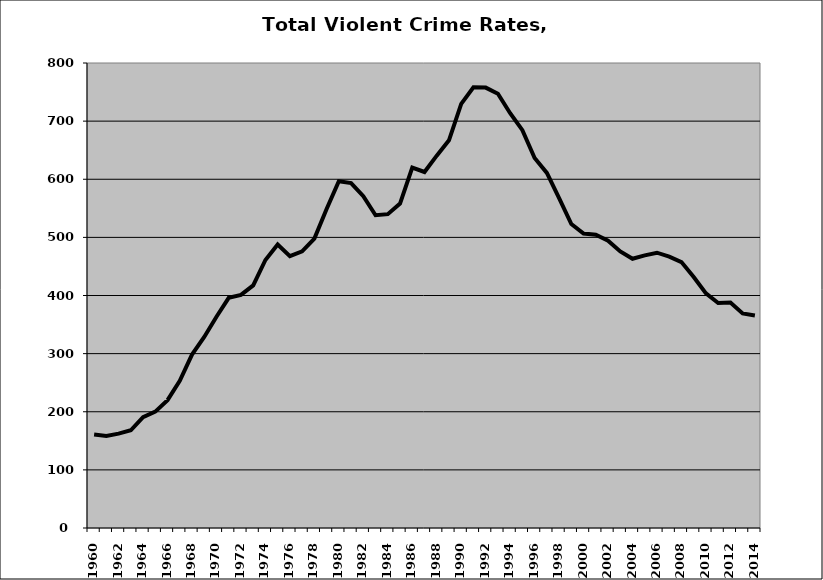
| Category | VCR |
|---|---|
| 1960.0 | 160.86 |
| 1961.0 | 158.144 |
| 1962.0 | 162.302 |
| 1963.0 | 168.169 |
| 1964.0 | 190.55 |
| 1965.0 | 200.175 |
| 1966.0 | 219.955 |
| 1967.0 | 253.184 |
| 1968.0 | 298.402 |
| 1969.0 | 328.659 |
| 1970.0 | 363.529 |
| 1971.0 | 395.952 |
| 1972.0 | 400.951 |
| 1973.0 | 417.396 |
| 1974.0 | 461.096 |
| 1975.0 | 487.847 |
| 1976.0 | 467.812 |
| 1977.0 | 475.926 |
| 1978.0 | 497.829 |
| 1979.0 | 548.858 |
| 1980.0 | 596.638 |
| 1981.0 | 593.479 |
| 1982.0 | 570.821 |
| 1983.0 | 538.122 |
| 1984.0 | 539.927 |
| 1985.0 | 558.064 |
| 1986.0 | 620.144 |
| 1987.0 | 612.491 |
| 1988.0 | 640.584 |
| 1989.0 | 666.9 |
| 1990.0 | 729.614 |
| 1991.0 | 758.177 |
| 1992.0 | 757.666 |
| 1993.0 | 747.148 |
| 1994.0 | 713.591 |
| 1995.0 | 684.463 |
| 1996.0 | 636.636 |
| 1997.0 | 610.977 |
| 1998.0 | 567.585 |
| 1999.0 | 522.953 |
| 2000.0 | 506.53 |
| 2001.0 | 504.519 |
| 2002.0 | 494.377 |
| 2003.0 | 475.835 |
| 2004.0 | 463.156 |
| 2005.0 | 469.043 |
| 2006.0 | 473.631 |
| 2007.0 | 466.922 |
| 2008.0 | 457.537 |
| 2009.0 | 431.879 |
| 2010.0 | 403.649 |
| 2011.0 | 387.06 |
| 2012.0 | 387.757 |
| 2013.0 | 369.07 |
| 2014.0 | 365.488 |